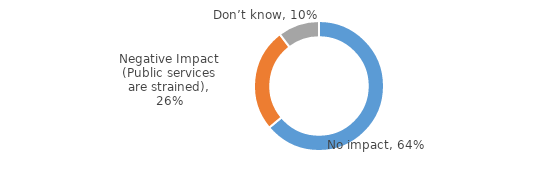
| Category | Series 0 |
|---|---|
| No impact | 0.639 |
| Negative Impact (Public services are strained) | 0.258 |
| Don’t know | 0.103 |